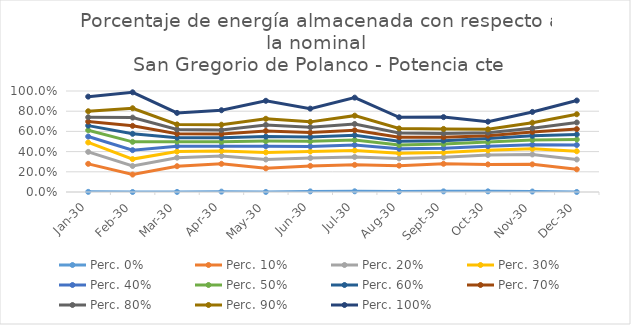
| Category | Perc. 0% | Perc. 10% | Perc. 20% | Perc. 30% | Perc. 40% | Perc. 50% | Perc. 60% | Perc. 70% | Perc. 80% | Perc. 90% | Perc. 100% |
|---|---|---|---|---|---|---|---|---|---|---|---|
| 2030-01-01 | 0.001 | 0.279 | 0.397 | 0.49 | 0.549 | 0.611 | 0.657 | 0.697 | 0.74 | 0.799 | 0.944 |
| 2030-02-01 | 0 | 0.173 | 0.258 | 0.326 | 0.414 | 0.497 | 0.576 | 0.655 | 0.737 | 0.829 | 0.987 |
| 2030-03-01 | 0.001 | 0.255 | 0.34 | 0.4 | 0.454 | 0.499 | 0.537 | 0.576 | 0.619 | 0.669 | 0.783 |
| 2030-04-01 | 0.004 | 0.279 | 0.357 | 0.407 | 0.453 | 0.497 | 0.537 | 0.573 | 0.613 | 0.666 | 0.81 |
| 2030-05-01 | 0.001 | 0.234 | 0.322 | 0.392 | 0.453 | 0.504 | 0.549 | 0.605 | 0.664 | 0.725 | 0.903 |
| 2030-06-01 | 0.006 | 0.259 | 0.337 | 0.401 | 0.451 | 0.501 | 0.544 | 0.588 | 0.642 | 0.694 | 0.825 |
| 2030-07-01 | 0.007 | 0.269 | 0.347 | 0.411 | 0.466 | 0.514 | 0.562 | 0.611 | 0.674 | 0.756 | 0.934 |
| 2030-08-01 | 0.004 | 0.261 | 0.333 | 0.383 | 0.428 | 0.465 | 0.502 | 0.543 | 0.585 | 0.629 | 0.74 |
| 2030-09-01 | 0.006 | 0.279 | 0.343 | 0.39 | 0.434 | 0.474 | 0.508 | 0.543 | 0.58 | 0.625 | 0.741 |
| 2030-10-01 | 0.006 | 0.273 | 0.366 | 0.412 | 0.454 | 0.494 | 0.529 | 0.558 | 0.587 | 0.621 | 0.696 |
| 2030-11-01 | 0.005 | 0.274 | 0.372 | 0.428 | 0.469 | 0.515 | 0.556 | 0.595 | 0.632 | 0.686 | 0.793 |
| 2030-12-01 | 0 | 0.224 | 0.322 | 0.403 | 0.465 | 0.52 | 0.57 | 0.623 | 0.688 | 0.77 | 0.906 |